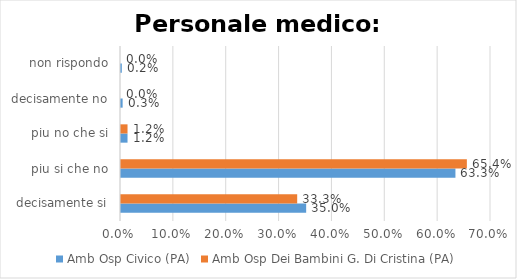
| Category | Amb Osp Civico (PA) | Amb Osp Dei Bambini G. Di Cristina (PA) |
|---|---|---|
| decisamente si | 0.35 | 0.333 |
| piu si che no | 0.633 | 0.654 |
| piu no che si | 0.012 | 0.012 |
| decisamente no | 0.003 | 0 |
| non rispondo | 0.002 | 0 |